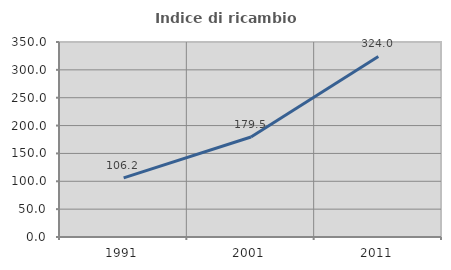
| Category | Indice di ricambio occupazionale  |
|---|---|
| 1991.0 | 106.167 |
| 2001.0 | 179.487 |
| 2011.0 | 324 |